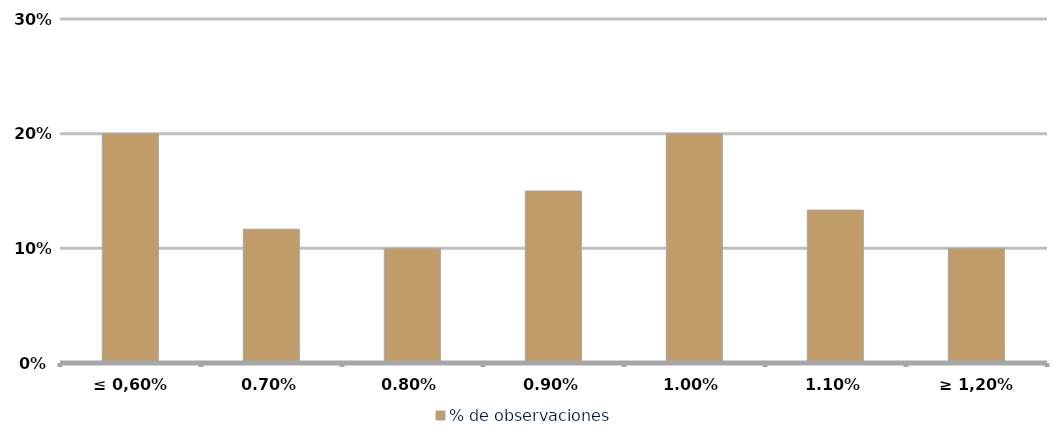
| Category | % de observaciones  |
|---|---|
| ≤ 0,60% | 0.2 |
| 0,70% | 0.117 |
| 0,80% | 0.1 |
| 0,90% | 0.15 |
| 1,00% | 0.2 |
| 1,10% | 0.133 |
| ≥ 1,20% | 0.1 |